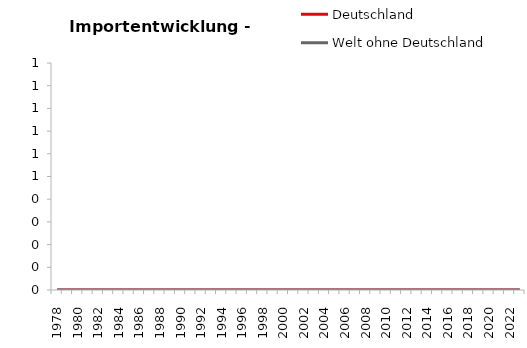
| Category | Deutschland | Welt ohne Deutschland | Series 2 | Series 3 |
|---|---|---|---|---|
| 1978.0 | 11.437 | 6.931 | 6.367 | 6.386 |
| 1979.0 | 13.003 | 8.208 | 7.762 | 7.356 |
| 1980.0 | 14.671 | 9.86 | 8.665 | 8.002 |
| 1981.0 | 14.796 | 10.787 | 9.107 | 9.13 |
| 1982.0 | 15.359 | 10.422 | 9.722 | 9.649 |
| 1983.0 | 16.458 | 10.746 | 10.602 | 9.813 |
| 1984.0 | 17.817 | 12.424 | 11.571 | 11.325 |
| 1985.0 | 20.076 | 13.427 | 13.244 | 12.655 |
| 1986.0 | 20.427 | 12.051 | 13.93 | 11.785 |
| 1987.0 | 20.71 | 12.126 | 14.816 | 11.418 |
| 1988.0 | 22.872 | 13.212 | 16.675 | 12.738 |
| 1989.0 | 25.555 | 15.304 | 18.406 | 14.384 |
| 1990.0 | 27.666 | 16.517 | 21.246 | 15.095 |
| 1991.0 | 28.984 | 17.788 | 23.229 | 14.941 |
| 1992.0 | 28.983 | 17.895 | 24.115 | 15.012 |
| 1993.0 | 26.656 | 17.443 | 22.639 | 14.577 |
| 1994.0 | 28.655 | 19.89 | 24.261 | 16.229 |
| 1995.0 | 33.145 | 19.875 | 27.635 | 18.293 |
| 1996.0 | 34.779 | 21.477 | 28.451 | 19.603 |
| 1997.0 | 37.484 | 24.31 | 31.161 | 23.748 |
| 1998.0 | 40.052 | 25.857 | 34.601 | 25.386 |
| 1999.0 | 42.883 | 27.532 | 35.989 | 27.605 |
| 2000.0 | 47.823 | 32.224 | 39.731 | 32.7 |
| 2001.0 | 49.964 | 33.958 | 41.296 | 35.265 |
| 2002.0 | 48.687 | 33.398 | 42.356 | 37.046 |
| 2003.0 | 51.983 | 34.693 | 42.887 | 37.884 |
| 2004.0 | 61.287 | 37.713 | 49.486 | 42.872 |
| 2005.0 | 63.796 | 40.472 | 51.463 | 45.477 |
| 2006.0 | 67.761 | 44.225 | 53.8 | 50.877 |
| 2007.0 | 74.392 | 48.449 | 58.879 | 56.486 |
| 2008.0 | 75.946 | 51.585 | 59.842 | 58.092 |
| 2009.0 | 62.378 | 41.91 | 49.875 | 45.451 |
| 2010.0 | 70.247 | 49.932 | 59.021 | 52.691 |
| 2011.0 | 78.39 | 58.755 | 65.024 | 58.948 |
| 2012.0 | 77.664 | 59.798 | 64.684 | 60.334 |
| 2013.0 | 76.776 | 59.284 | 64.736 | 61.91 |
| 2014.0 | 76.029 | 59.006 | 65.093 | 63.378 |
| 2015.0 | 77.126 | 61.17 | 67.477 | 64.812 |
| 2016.0 | 78.959 | 61.873 | 68.465 | 64.115 |
| 2017.0 | 85.201 | 67.598 | 73.267 | 69.75 |
| 2018.0 | 87.474 | 72.724 | 77.32 | 73.806 |
| 2019.0 | 86.496 | 74.456 | 76.974 | 76.363 |
| 2020.0 | 79.117 | 68.153 | 74.235 | 69.793 |
| 2021.0 | 92.642 | 86.579 | 85.336 | 81.426 |
| 2022.0 | 108.103 | 106.142 | 99.16 | 96.215 |
| 2023.0 | 100 | 100 | 100 | 100 |